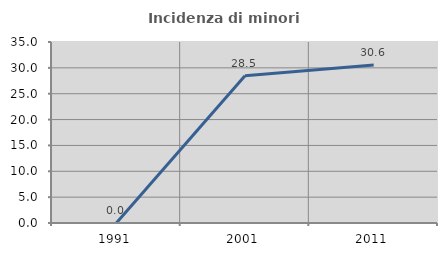
| Category | Incidenza di minori stranieri |
|---|---|
| 1991.0 | 0 |
| 2001.0 | 28.492 |
| 2011.0 | 30.571 |